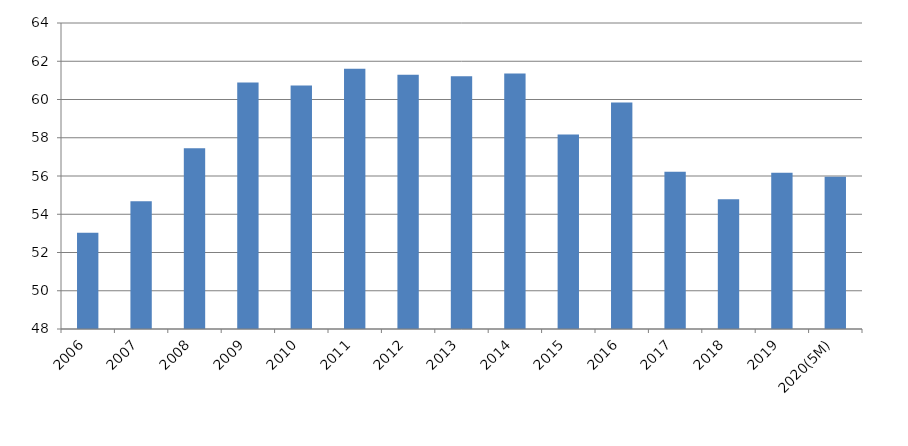
| Category | TPES Self-sufficiency ratio |
|---|---|
| 2006 | 53.035 |
| 2007 | 54.675 |
| 2008 | 57.453 |
| 2009 | 60.887 |
| 2010 | 60.729 |
| 2011 | 61.606 |
| 2012 | 61.294 |
| 2013 | 61.216 |
| 2014 | 61.356 |
| 2015 | 58.176 |
| 2016 | 59.848 |
| 2017 | 56.224 |
| 2018 | 54.787 |
| 2019 | 56.176 |
| 2020(5M) | 55.957 |